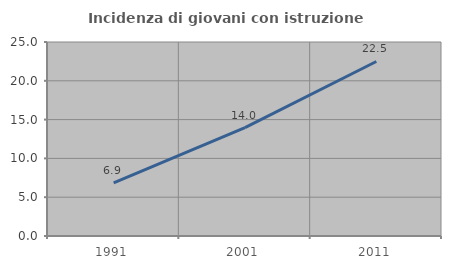
| Category | Incidenza di giovani con istruzione universitaria |
|---|---|
| 1991.0 | 6.85 |
| 2001.0 | 13.974 |
| 2011.0 | 22.49 |